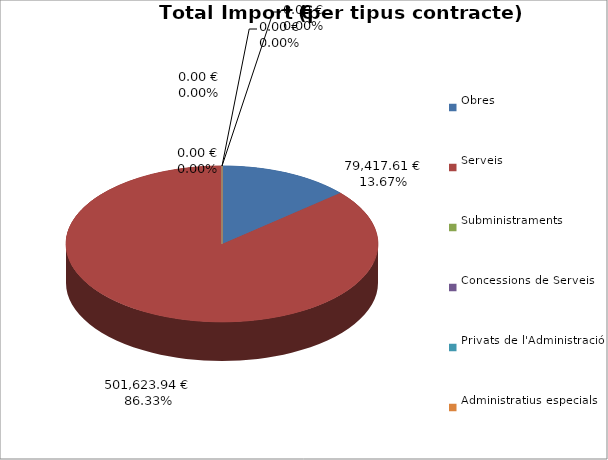
| Category | Total preu
(amb IVA) |
|---|---|
| Obres | 79417.61 |
| Serveis | 501623.94 |
| Subministraments | 0 |
| Concessions de Serveis | 0 |
| Privats de l'Administració | 0 |
| Administratius especials | 0 |